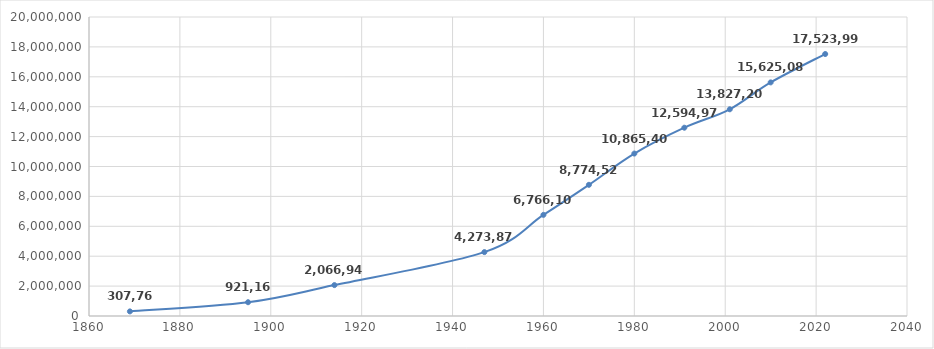
| Category | Series 0 |
|---|---|
| 1869.0 | 307761 |
| 1895.0 | 921168 |
| 1914.0 | 2066948 |
| 1947.0 | 4273874 |
| 1960.0 | 6766108 |
| 1970.0 | 8774529 |
| 1980.0 | 10865408 |
| 1991.0 | 12594974 |
| 2001.0 | 13827203 |
| 2010.0 | 15625084 |
| 2022.0 | 17523996 |